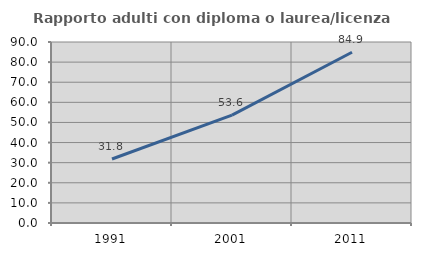
| Category | Rapporto adulti con diploma o laurea/licenza media  |
|---|---|
| 1991.0 | 31.818 |
| 2001.0 | 53.614 |
| 2011.0 | 84.906 |